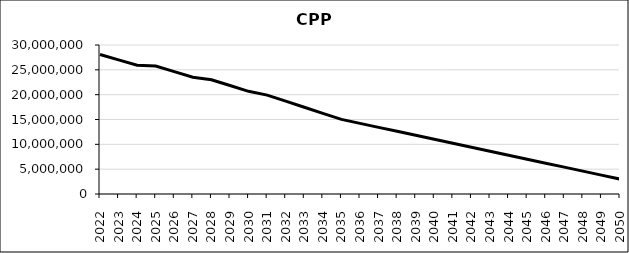
| Category | Annual Caps - not rounded (see row 4 for rounded finals) |
|---|---|
| 2022.0 | 28081334.617 |
| 2023.0 | 27001283.286 |
| 2024.0 | 25921231.954 |
| 2025.0 | 25763209.29 |
| 2026.0 | 24637056.525 |
| 2027.0 | 23510903.761 |
| 2028.0 | 23013190.145 |
| 2029.0 | 21842148.869 |
| 2030.0 | 20671107.594 |
| 2031.0 | 19910423.78 |
| 2032.0 | 18688087.821 |
| 2033.0 | 17465751.863 |
| 2034.0 | 16243415.905 |
| 2035.0 | 15021079.947 |
| 2036.0 | 14219955.683 |
| 2037.0 | 13418831.42 |
| 2038.0 | 12617707.156 |
| 2039.0 | 11816582.892 |
| 2040.0 | 11015458.628 |
| 2041.0 | 10214334.364 |
| 2042.0 | 9413210.1 |
| 2043.0 | 8612085.836 |
| 2044.0 | 7810961.573 |
| 2045.0 | 7009837.309 |
| 2046.0 | 6208713.045 |
| 2047.0 | 5407588.781 |
| 2048.0 | 4606464.517 |
| 2049.0 | 3805340.253 |
| 2050.0 | 3004215.989 |